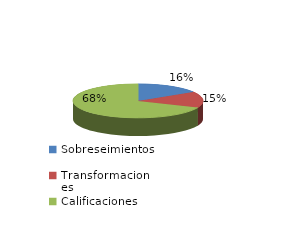
| Category | Series 0 |
|---|---|
| Sobreseimientos | 1070 |
| Transformaciones | 1025 |
| Calificaciones | 4553 |